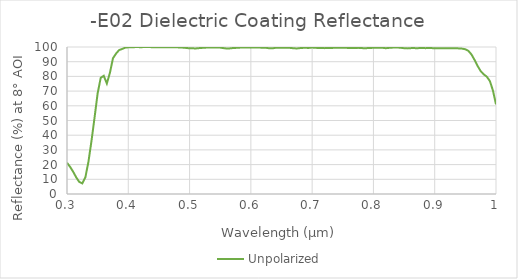
| Category | Unpolarized |
|---|---|
| 0.3 | 21.263 |
| 0.305 | 18.496 |
| 0.31 | 15.177 |
| 0.315 | 11.36 |
| 0.32 | 8.211 |
| 0.325 | 7.22 |
| 0.33 | 11.392 |
| 0.335 | 21.958 |
| 0.34 | 36.203 |
| 0.345 | 52.092 |
| 0.35 | 68.526 |
| 0.355 | 79.013 |
| 0.36 | 80.412 |
| 0.365 | 75.142 |
| 0.37 | 82.374 |
| 0.375 | 92.314 |
| 0.38 | 95.516 |
| 0.385 | 97.891 |
| 0.39 | 98.67 |
| 0.395 | 99.561 |
| 0.4 | 99.787 |
| 0.405 | 99.772 |
| 0.41 | 99.905 |
| 0.415 | 99.996 |
| 0.42 | 99.83 |
| 0.425 | 99.961 |
| 0.43 | 99.915 |
| 0.435 | 99.946 |
| 0.44 | 99.854 |
| 0.445 | 99.832 |
| 0.45 | 99.844 |
| 0.455 | 99.871 |
| 0.46 | 99.904 |
| 0.465 | 99.871 |
| 0.47 | 99.864 |
| 0.475 | 99.835 |
| 0.48 | 99.765 |
| 0.485 | 99.673 |
| 0.49 | 99.545 |
| 0.495 | 99.34 |
| 0.5 | 99.11 |
| 0.505 | 99.102 |
| 0.51 | 99.015 |
| 0.515 | 99.223 |
| 0.52 | 99.385 |
| 0.525 | 99.563 |
| 0.53 | 99.593 |
| 0.535 | 99.658 |
| 0.54 | 99.709 |
| 0.545 | 99.729 |
| 0.55 | 99.585 |
| 0.555 | 99.259 |
| 0.56 | 99.001 |
| 0.565 | 99.027 |
| 0.57 | 99.264 |
| 0.575 | 99.378 |
| 0.58 | 99.528 |
| 0.585 | 99.628 |
| 0.59 | 99.596 |
| 0.595 | 99.629 |
| 0.6 | 99.57 |
| 0.605 | 99.642 |
| 0.61 | 99.604 |
| 0.615 | 99.578 |
| 0.62 | 99.541 |
| 0.625 | 99.449 |
| 0.63 | 99.131 |
| 0.635 | 99.087 |
| 0.64 | 99.441 |
| 0.645 | 99.477 |
| 0.65 | 99.503 |
| 0.655 | 99.568 |
| 0.66 | 99.49 |
| 0.665 | 99.375 |
| 0.67 | 99.116 |
| 0.675 | 99.018 |
| 0.68 | 99.241 |
| 0.685 | 99.408 |
| 0.69 | 99.407 |
| 0.695 | 99.399 |
| 0.7 | 99.62 |
| 0.705 | 99.468 |
| 0.71 | 99.315 |
| 0.715 | 99.281 |
| 0.72 | 99.227 |
| 0.725 | 99.314 |
| 0.73 | 99.3 |
| 0.735 | 99.431 |
| 0.74 | 99.464 |
| 0.745 | 99.461 |
| 0.75 | 99.484 |
| 0.755 | 99.425 |
| 0.76 | 99.374 |
| 0.765 | 99.358 |
| 0.77 | 99.378 |
| 0.775 | 99.407 |
| 0.78 | 99.378 |
| 0.785 | 99.077 |
| 0.79 | 99.259 |
| 0.795 | 99.298 |
| 0.8 | 99.494 |
| 0.805 | 99.453 |
| 0.81 | 99.508 |
| 0.815 | 99.473 |
| 0.82 | 99.174 |
| 0.825 | 99.395 |
| 0.83 | 99.528 |
| 0.835 | 99.716 |
| 0.84 | 99.61 |
| 0.845 | 99.458 |
| 0.85 | 99.18 |
| 0.855 | 99.056 |
| 0.86 | 99.192 |
| 0.865 | 99.347 |
| 0.87 | 99.146 |
| 0.875 | 99.268 |
| 0.88 | 99.308 |
| 0.885 | 99.218 |
| 0.89 | 99.307 |
| 0.895 | 99.249 |
| 0.9 | 99.153 |
| 0.905 | 99.182 |
| 0.91 | 99.199 |
| 0.915 | 99.176 |
| 0.92 | 99.195 |
| 0.925 | 99.17 |
| 0.93 | 99.084 |
| 0.935 | 99.131 |
| 0.94 | 99.035 |
| 0.945 | 98.882 |
| 0.95 | 98.436 |
| 0.955 | 97.341 |
| 0.96 | 94.911 |
| 0.965 | 91.206 |
| 0.97 | 87.095 |
| 0.975 | 83.618 |
| 0.98 | 81.393 |
| 0.985 | 79.785 |
| 0.99 | 76.832 |
| 0.995 | 70.401 |
| 1.0 | 60.982 |